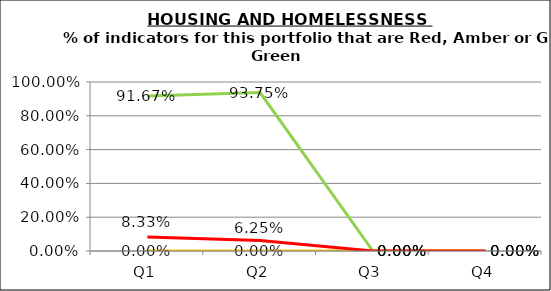
| Category | Green | Amber | Red |
|---|---|---|---|
| Q1 | 0.917 | 0 | 0.083 |
| Q2 | 0.938 | 0 | 0.062 |
| Q3 | 0 | 0 | 0 |
| Q4 | 0 | 0 | 0 |